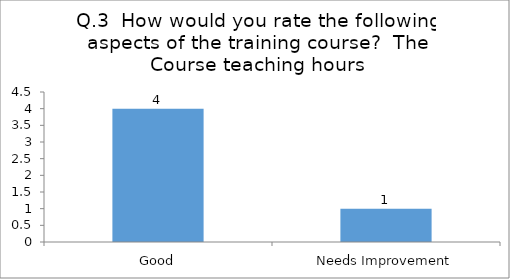
| Category | Q.3  How would you rate the following aspects of the training course?  |
|---|---|
| Good | 4 |
| Needs Improvement | 1 |